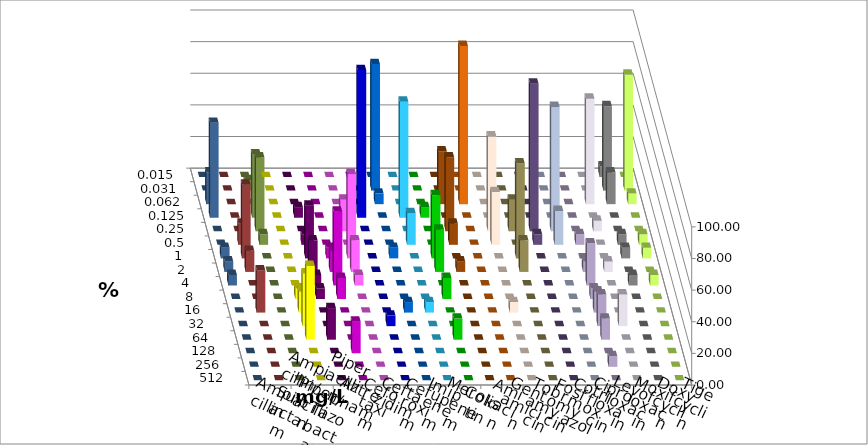
| Category | Ampicillin | Ampicillin/ Sulbactam | Piperacillin | Piperacillin/ Tazobactam | Aztreonam | Cefotaxim | Ceftazidim | Cefuroxim | Imipenem | Meropenem | Colistin | Amikacin | Gentamicin | Tobramycin | Fosfomycin | Cotrimoxazol | Ciprofloxacin | Levofloxacin | Moxifloxacin | Doxycyclin | Tigecyclin |
|---|---|---|---|---|---|---|---|---|---|---|---|---|---|---|---|---|---|---|---|---|---|
| 0.015 | 0 | 0 | 0 | 0 | 0 | 0 | 0 | 0 | 0 | 0 | 0 | 0 | 0 | 0 | 0 | 0 | 6.667 | 0 | 0 | 0 | 0 |
| 0.031 | 0 | 0 | 0 | 0 | 0 | 80 | 0 | 0 | 0 | 0 | 0 | 0 | 0 | 0 | 0 | 0 | 53.333 | 73.333 | 0 | 0 | 6.667 |
| 0.062 | 0 | 0 | 0 | 0 | 0 | 6.667 | 0 | 0 | 33.333 | 100 | 0 | 0 | 0 | 0 | 0 | 66.667 | 20 | 6.667 | 20 | 0 | 0 |
| 0.125 | 0 | 6.667 | 0 | 0 | 93.333 | 0 | 73.333 | 6.667 | 0 | 0 | 0 | 0 | 0 | 0 | 0 | 0 | 0 | 0 | 60 | 0 | 40 |
| 0.25 | 0 | 0 | 0 | 20 | 0 | 0 | 0 | 0 | 46.667 | 0 | 60 | 20 | 93.333 | 78.571 | 0 | 6.667 | 0 | 0 | 0 | 0 | 46.667 |
| 0.5 | 0 | 6.667 | 0 | 0 | 0 | 0 | 20 | 0 | 13.333 | 0 | 33.333 | 0 | 6.667 | 21.429 | 6.667 | 0 | 6.667 | 6.667 | 0 | 13.333 | 6.667 |
| 1.0 | 0 | 33.333 | 6.667 | 53.333 | 0 | 6.667 | 0 | 40 | 0 | 0 | 0 | 60 | 0 | 0 | 0 | 0 | 6.667 | 6.667 | 6.667 | 46.667 | 0 |
| 2.0 | 0 | 20 | 13.333 | 20 | 0 | 0 | 0 | 26.667 | 6.667 | 0 | 0 | 20 | 0 | 0 | 6.667 | 6.667 | 0 | 0 | 6.667 | 13.333 | 0 |
| 4.0 | 0 | 6.667 | 46.667 | 6.667 | 0 | 0 | 0 | 0 | 0 | 0 | 0 | 0 | 0 | 0 | 26.667 | 0 | 6.667 | 6.667 | 6.667 | 0 | 0 |
| 8.0 | 6.667 | 6.667 | 13.333 | 0 | 0 | 0 | 0 | 13.333 | 0 | 0 | 0 | 0 | 0 | 0 | 6.667 | 0 | 0 | 0 | 0 | 0 | 0 |
| 16.0 | 13.333 | 0 | 0 | 0 | 0 | 6.667 | 6.667 | 0 | 0 | 0 | 6.667 | 0 | 0 | 0 | 13.333 | 0 | 0 | 0 | 0 | 26.667 | 0 |
| 32.0 | 33.333 | 0 | 0 | 0 | 6.667 | 0 | 0 | 0 | 0 | 0 | 0 | 0 | 0 | 0 | 20 | 20 | 0 | 0 | 0 | 0 | 0 |
| 64.0 | 46.667 | 20 | 0 | 0 | 0 | 0 | 0 | 13.333 | 0 | 0 | 0 | 0 | 0 | 0 | 13.333 | 0 | 0 | 0 | 0 | 0 | 0 |
| 128.0 | 0 | 0 | 20 | 0 | 0 | 0 | 0 | 0 | 0 | 0 | 0 | 0 | 0 | 0 | 0 | 0 | 0 | 0 | 0 | 0 | 0 |
| 256.0 | 0 | 0 | 0 | 0 | 0 | 0 | 0 | 0 | 0 | 0 | 0 | 0 | 0 | 0 | 6.667 | 0 | 0 | 0 | 0 | 0 | 0 |
| 512.0 | 0 | 0 | 0 | 0 | 0 | 0 | 0 | 0 | 0 | 0 | 0 | 0 | 0 | 0 | 0 | 0 | 0 | 0 | 0 | 0 | 0 |